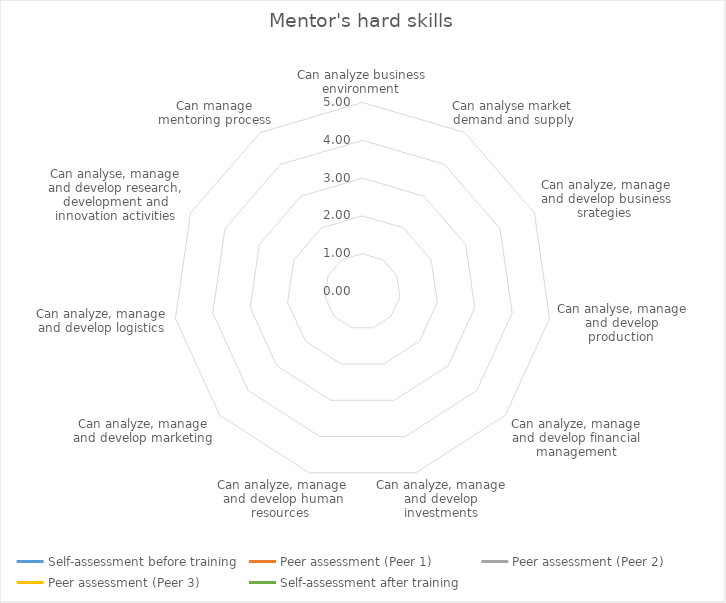
| Category | Self-assessment before training | Peer assessment (Peer 1) | Peer assessment (Peer 2) | Peer assessment (Peer 3) | Self-assessment after training |
|---|---|---|---|---|---|
| Can analyze business environment  | 0 | 0 | 0 | 0 | 0 |
| Can analyse market demand and supply | 0 | 0 | 0 | 0 | 0 |
| Can analyze, manage and develop business srategies  | 0 | 0 | 0 | 0 | 0 |
| Can analyse, manage and develop production  | 0 | 0 | 0 | 0 | 0 |
| Can analyze, manage and develop financial management | 0 | 0 | 0 | 0 | 0 |
| Can analyze, manage and develop investments | 0 | 0 | 0 | 0 | 0 |
| Can analyze, manage and develop human resources  | 0 | 0 | 0 | 0 | 0 |
| Can analyze, manage and develop marketing | 0 | 0 | 0 | 0 | 0 |
| Can analyze, manage and develop logistics | 0 | 0 | 0 | 0 | 0 |
| Can analyse, manage and develop research, development and innovation activities | 0 | 0 | 0 | 0 | 0 |
| Can manage mentoring process | 0 | 0 | 0 | 0 | 0 |